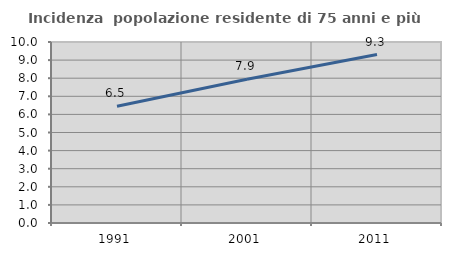
| Category | Incidenza  popolazione residente di 75 anni e più |
|---|---|
| 1991.0 | 6.455 |
| 2001.0 | 7.937 |
| 2011.0 | 9.306 |